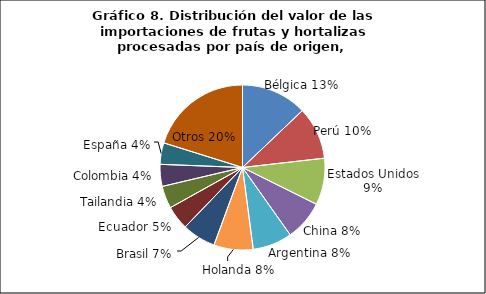
| Category | Series 0 |
|---|---|
| Bélgica | 49594947.66 |
| Perú | 39595388.34 |
| Estados Unidos | 35189038.33 |
| China | 30163017.8 |
| Argentina | 29731284.21 |
| Holanda | 29568966.67 |
| Brasil | 25370603.69 |
| Ecuador | 18101769.8 |
| Tailandia | 16905291.4 |
| Colombia | 16554383.44 |
| España | 16182399.63 |
| Otros | 77590801.95 |